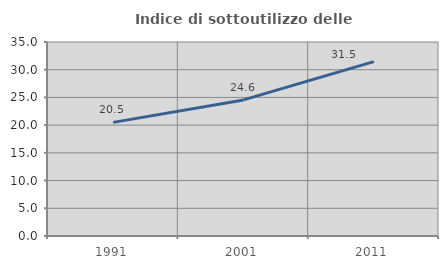
| Category | Indice di sottoutilizzo delle abitazioni  |
|---|---|
| 1991.0 | 20.499 |
| 2001.0 | 24.552 |
| 2011.0 | 31.462 |